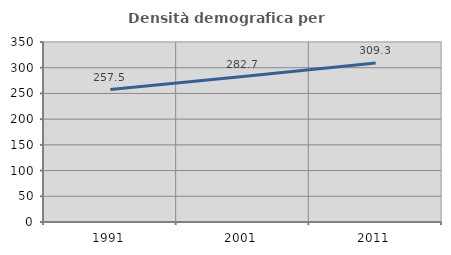
| Category | Densità demografica |
|---|---|
| 1991.0 | 257.473 |
| 2001.0 | 282.719 |
| 2011.0 | 309.314 |